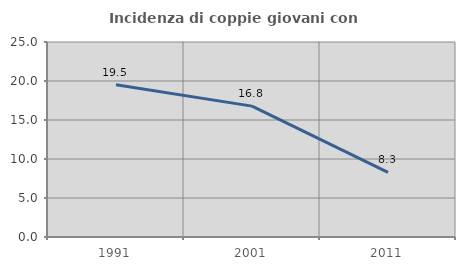
| Category | Incidenza di coppie giovani con figli |
|---|---|
| 1991.0 | 19.531 |
| 2001.0 | 16.779 |
| 2011.0 | 8.28 |